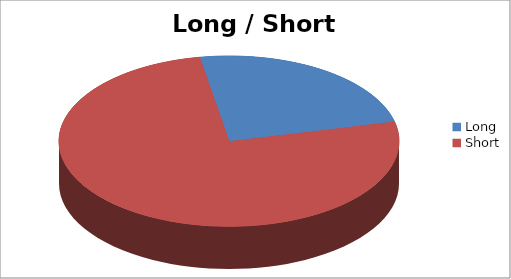
| Category | Long / Short Entries |
|---|---|
| Long | 13 |
| Short | 41 |